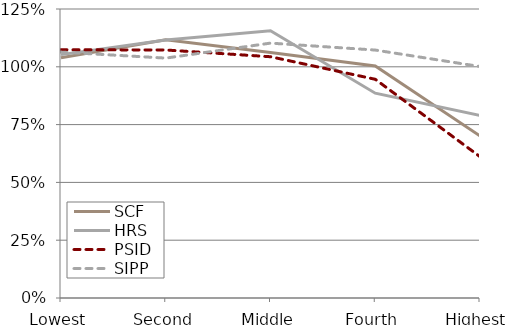
| Category | SCF | HRS | PSID | SIPP |
|---|---|---|---|---|
| Lowest | 1.039 | 1.053 | 1.074 | 1.064 |
| Second | 1.117 | 1.116 | 1.073 | 1.038 |
| Middle | 1.062 | 1.156 | 1.044 | 1.102 |
| Fourth | 1.004 | 0.886 | 0.946 | 1.072 |
| Highest | 0.701 | 0.79 | 0.611 | 1.001 |